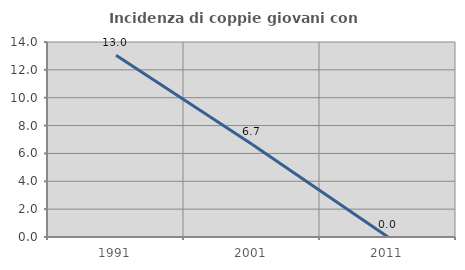
| Category | Incidenza di coppie giovani con figli |
|---|---|
| 1991.0 | 13.043 |
| 2001.0 | 6.667 |
| 2011.0 | 0 |